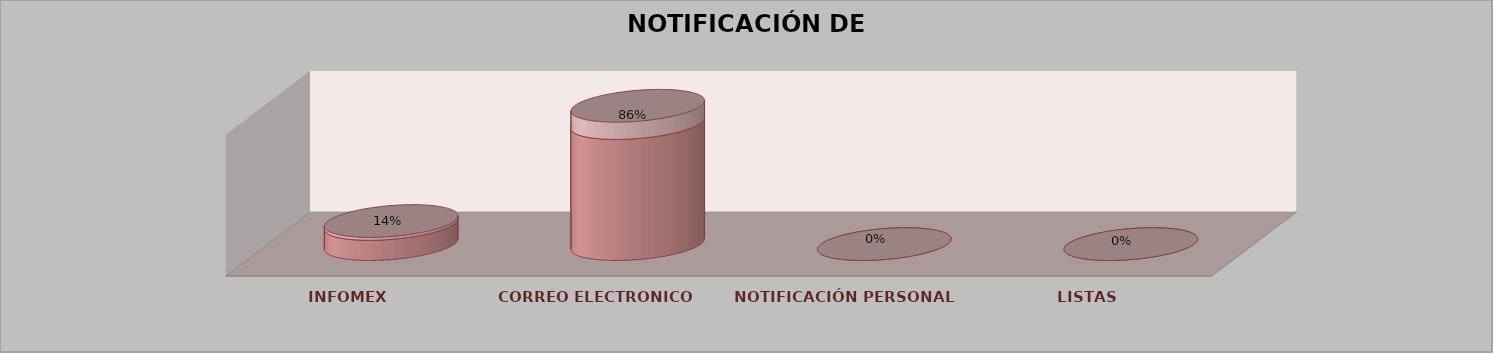
| Category | Series 0 | Series 1 | Series 2 | Series 3 | Series 4 |
|---|---|---|---|---|---|
| INFOMEX |  |  |  | 1 | 0.143 |
| CORREO ELECTRONICO |  |  |  | 6 | 0.857 |
| NOTIFICACIÓN PERSONAL |  |  |  | 0 | 0 |
| LISTAS |  |  |  | 0 | 0 |